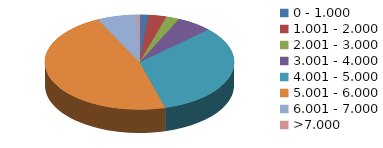
| Category | Series 0 |
|---|---|
| 0 - 1.000 | 4 |
| 1.001 - 2.000 | 8 |
| 2.001 - 3.000 | 6 |
| 3.001 - 4.000 | 16 |
| 4.001 - 5.000 | 86 |
| 5.001 - 6.000 | 124 |
| 6.001 - 7.000 | 18 |
| >7.000 | 1 |